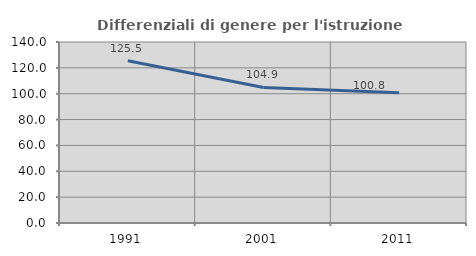
| Category | Differenziali di genere per l'istruzione superiore |
|---|---|
| 1991.0 | 125.507 |
| 2001.0 | 104.873 |
| 2011.0 | 100.808 |